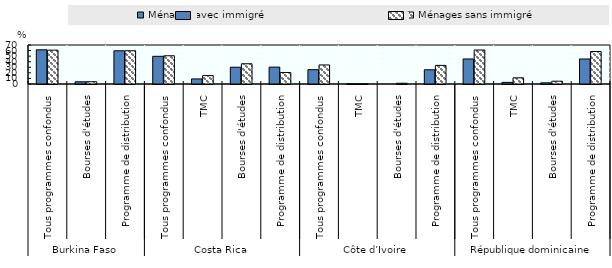
| Category | Ménages avec immigré | Ménages sans immigré |
|---|---|---|
| 0 | 61.4 | 60.7 |
| 1 | 4 | 4.1 |
| 2 | 59.6 | 59.7 |
| 3 | 49.7 | 50.7 |
| 4 | 9.1 | 15.1 |
| 5 | 30.1 | 36.3 |
| 6 | 30.3 | 20.6 |
| 7 | 25.7 | 34.2 |
| 8 | 0.4 | 0.4 |
| 9 | 0 | 1.36 |
| 10 | 25.5 | 33.4 |
| 11 | 44.9 | 61 |
| 12 | 2.9 | 11.1 |
| 13 | 2.1 | 5 |
| 14 | 44.9 | 58.4 |